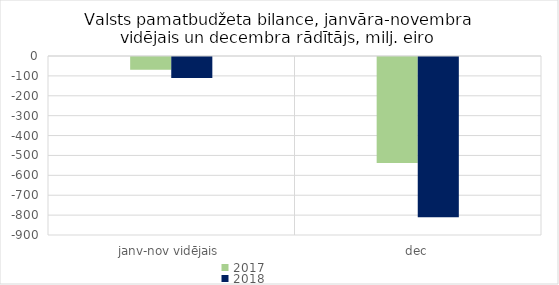
| Category | 2017 | 2018 |
|---|---|---|
| janv-nov vidējais | -64462.761 | -105002.425 |
| dec | -532871.659 | -805850.118 |